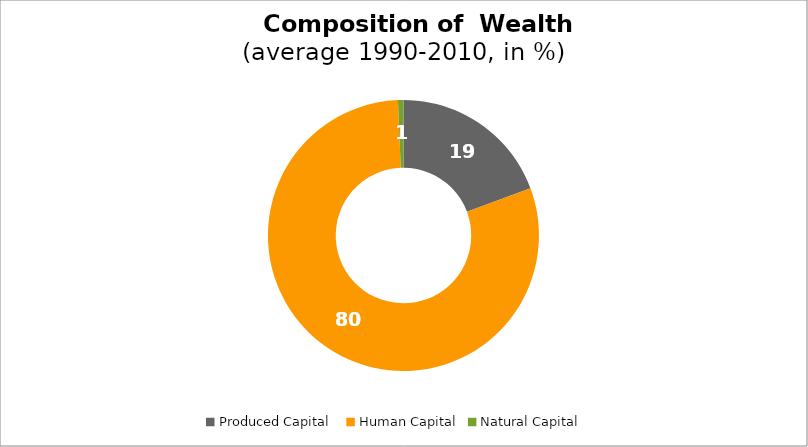
| Category | Series 0 |
|---|---|
| Produced Capital  | 19.33 |
| Human Capital | 80.016 |
| Natural Capital | 0.654 |